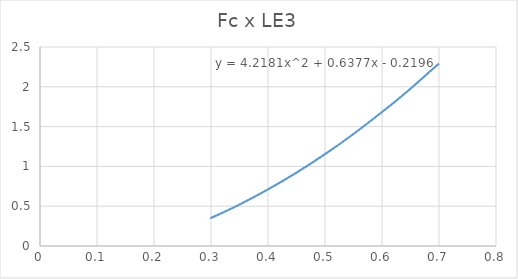
| Category | Series 0 |
|---|---|
| 0.3 | 0.352 |
| 0.35 | 0.52 |
| 0.4 | 0.71 |
| 0.45 | 0.921 |
| 0.5 | 1.154 |
| 0.55 | 1.407 |
| 0.6 | 1.682 |
| 0.65 | 1.976 |
| 0.7 | 2.294 |